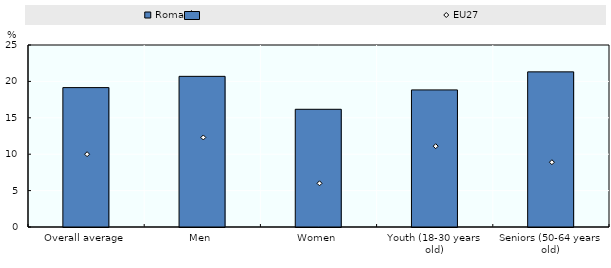
| Category | Romania |
|---|---|
| Overall average | 19.149 |
| Men | 20.692 |
| Women | 16.169 |
| Youth (18-30 years old) | 18.831 |
| Seniors (50-64 years old) | 21.309 |